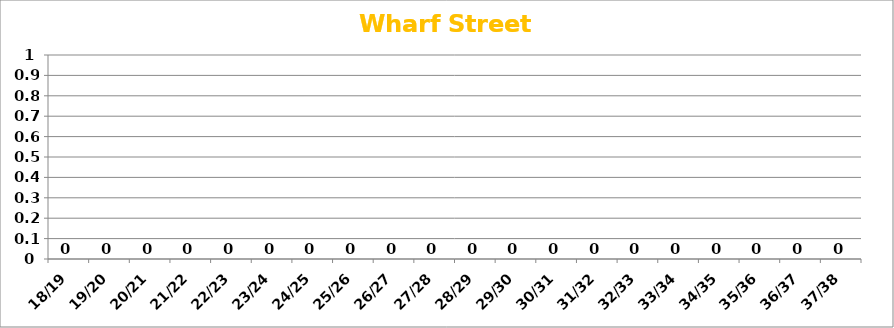
| Category | Wharf Street Quarter |
|---|---|
| 18/19 | 0 |
| 19/20 | 0 |
| 20/21 | 0 |
| 21/22 | 0 |
| 22/23 | 0 |
| 23/24 | 0 |
| 24/25 | 0 |
| 25/26 | 0 |
| 26/27 | 0 |
| 27/28 | 0 |
| 28/29 | 0 |
| 29/30 | 0 |
| 30/31 | 0 |
| 31/32 | 0 |
| 32/33 | 0 |
| 33/34 | 0 |
| 34/35 | 0 |
| 35/36 | 0 |
| 36/37 | 0 |
| 37/38 | 0 |